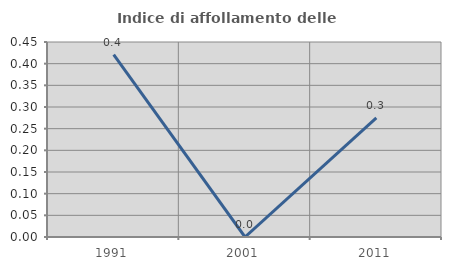
| Category | Indice di affollamento delle abitazioni  |
|---|---|
| 1991.0 | 0.421 |
| 2001.0 | 0 |
| 2011.0 | 0.275 |